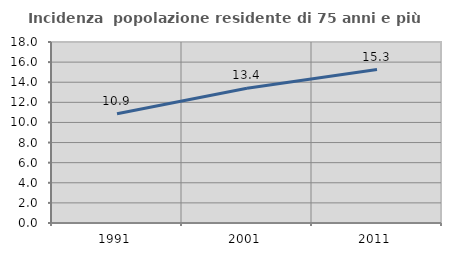
| Category | Incidenza  popolazione residente di 75 anni e più |
|---|---|
| 1991.0 | 10.871 |
| 2001.0 | 13.391 |
| 2011.0 | 15.261 |